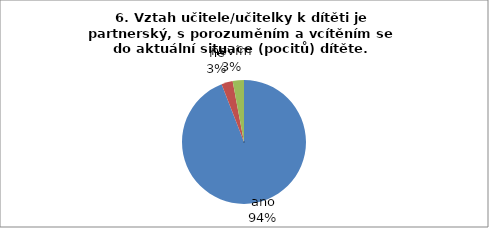
| Category | 6. |
|---|---|
| ano | 32 |
| ne | 1 |
| nevím | 1 |